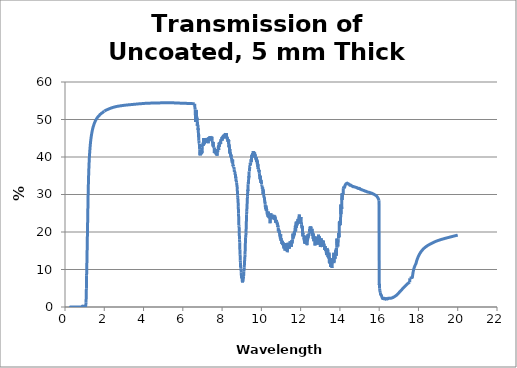
| Category | Series 0 |
|---|---|
| 0.2 | 0.035 |
| 0.21 | 0.001 |
| 0.22 | 0.003 |
| 0.23 | 0.002 |
| 0.24 | 0.006 |
| 0.25 | 0.004 |
| 0.26 | 0.007 |
| 0.27 | 0.01 |
| 0.28 | 0.009 |
| 0.29 | 0.01 |
| 0.3 | 0.008 |
| 0.31 | 0.002 |
| 0.32 | 0 |
| 0.33 | 0.002 |
| 0.34 | 0.003 |
| 0.35 | 0.001 |
| 0.36 | 0.004 |
| 0.37 | 0.001 |
| 0.38 | 0 |
| 0.39 | 0.001 |
| 0.4 | 0 |
| 0.41 | 0.002 |
| 0.42 | 0.002 |
| 0.43 | 0.002 |
| 0.44 | 0.003 |
| 0.45 | 0.001 |
| 0.46 | 0.001 |
| 0.47 | 0.006 |
| 0.48 | 0.008 |
| 0.49 | 0.001 |
| 0.5 | 0 |
| 0.51 | 0.003 |
| 0.52 | 0.005 |
| 0.53 | 0.008 |
| 0.54 | 0.008 |
| 0.55 | 0.003 |
| 0.56 | 0.001 |
| 0.57 | 0.005 |
| 0.58 | 0.006 |
| 0.59 | 0.004 |
| 0.6 | 0.006 |
| 0.61 | 0.007 |
| 0.62 | 0.005 |
| 0.63 | 0.007 |
| 0.64 | 0.005 |
| 0.65 | 0.003 |
| 0.66 | 0.006 |
| 0.67 | 0.006 |
| 0.68 | 0.003 |
| 0.69 | 0.005 |
| 0.7 | 0.006 |
| 0.71 | 0.004 |
| 0.72 | 0.006 |
| 0.73 | 0.007 |
| 0.74 | 0.004 |
| 0.75 | 0.005 |
| 0.76 | 0.005 |
| 0.77 | 0.003 |
| 0.78 | 0.005 |
| 0.79 | 0.005 |
| 0.8 | 0.005 |
| 0.81 | 0.005 |
| 0.82 | 0.003 |
| 0.83 | 0.006 |
| 0.84 | 0.005 |
| 0.85 | 0.025 |
| 0.86 | 0.058 |
| 0.87 | 0.173 |
| 0.88 | 0.228 |
| 0.89 | 0.239 |
| 0.9 | 0.217 |
| 0.91 | 0.198 |
| 0.92 | 0.178 |
| 0.93 | 0.204 |
| 0.94 | 0.229 |
| 0.95 | 0.2 |
| 0.96 | 0.166 |
| 0.97 | 0.136 |
| 0.98 | 0.11 |
| 0.99 | 0.09 |
| 1.0 | 0.073 |
| 1.01 | 0.096 |
| 1.02 | 0.149 |
| 1.03 | 0.175 |
| 1.04 | 0.192 |
| 1.05 | 0.255 |
| 1.06 | 0.54 |
| 1.07 | 1.258 |
| 1.08 | 2.666 |
| 1.09 | 5.006 |
| 1.1 | 8.44 |
| 1.11 | 10.669 |
| 1.12 | 13.213 |
| 1.13 | 15.979 |
| 1.14 | 18.865 |
| 1.15 | 21.82 |
| 1.16 | 24.784 |
| 1.17 | 27.65 |
| 1.18 | 30.31 |
| 1.19 | 32.607 |
| 1.2 | 34.524 |
| 1.21 | 36.13 |
| 1.22 | 37.499 |
| 1.23 | 38.69 |
| 1.24 | 39.722 |
| 1.25 | 40.62 |
| 1.26 | 41.416 |
| 1.27 | 42.127 |
| 1.28 | 42.772 |
| 1.29 | 43.359 |
| 1.3 | 43.896 |
| 1.31 | 44.389 |
| 1.32 | 44.831 |
| 1.33 | 45.226 |
| 1.34 | 45.583 |
| 1.35 | 45.913 |
| 1.36 | 46.223 |
| 1.37 | 46.508 |
| 1.38 | 46.792 |
| 1.39 | 47.058 |
| 1.4 | 47.299 |
| 1.41 | 47.528 |
| 1.42 | 47.741 |
| 1.43 | 47.939 |
| 1.44 | 48.125 |
| 1.45 | 48.299 |
| 1.46 | 48.465 |
| 1.47 | 48.625 |
| 1.48 | 48.776 |
| 1.49 | 48.919 |
| 1.5 | 49.055 |
| 1.51 | 49.184 |
| 1.52 | 49.308 |
| 1.53 | 49.426 |
| 1.54 | 49.539 |
| 1.55 | 49.647 |
| 1.56 | 49.749 |
| 1.57 | 49.847 |
| 1.58 | 49.942 |
| 1.59 | 50.034 |
| 1.6 | 50.122 |
| 1.61 | 50.207 |
| 1.62 | 50.288 |
| 1.63 | 50.365 |
| 1.64 | 50.439 |
| 1.65 | 50.512 |
| 1.66 | 50.582 |
| 1.67 | 50.65 |
| 1.68 | 50.716 |
| 1.69 | 50.78 |
| 1.7 | 50.842 |
| 1.71 | 50.903 |
| 1.72 | 50.961 |
| 1.73 | 51.015 |
| 1.74 | 51.069 |
| 1.75 | 51.122 |
| 1.76 | 51.179 |
| 1.77 | 51.244 |
| 1.78 | 51.304 |
| 1.79 | 51.353 |
| 1.8 | 51.399 |
| 1.81 | 51.442 |
| 1.82 | 51.484 |
| 1.83 | 51.526 |
| 1.84 | 51.571 |
| 1.85 | 51.612 |
| 1.86 | 51.651 |
| 1.87 | 51.703 |
| 1.88 | 51.742 |
| 1.89 | 51.773 |
| 1.9 | 51.804 |
| 1.91 | 51.835 |
| 1.92 | 51.879 |
| 1.93 | 51.927 |
| 1.94 | 51.975 |
| 1.95 | 52.021 |
| 1.96 | 52.061 |
| 1.97 | 52.1 |
| 1.98 | 52.133 |
| 1.99 | 52.164 |
| 2.0 | 52.195 |
| 2.0000658340912802 | 52.226 |
| 2.0099426675075898 | 52.257 |
| 2.02009856612705 | 52.289 |
| 2.02996929826891 | 52.319 |
| 2.0398370004275 | 52.348 |
| 2.04998346034472 | 52.373 |
| 2.0598449707261897 | 52.399 |
| 2.06998503080197 | 52.424 |
| 2.07984028883395 | 52.454 |
| 2.08997388678498 | 52.483 |
| 2.0998228319334897 | 52.51 |
| 2.10994990551615 | 52.538 |
| 2.1200736471999 | 52.56 |
| 2.12991296429671 | 52.584 |
| 2.14003008788415 | 52.608 |
| 2.14986294050753 | 52.631 |
| 2.1599733838562103 | 52.651 |
| 2.1697997116098198 | 52.675 |
| 2.17990341261835 | 52.697 |
| 2.19000367126184 | 52.718 |
| 2.19982005175428 | 52.741 |
| 2.20991347454654 | 52.764 |
| 2.22000340758378 | 52.79 |
| 2.2298097038741598 | 52.811 |
| 2.2398927076444504 | 52.83 |
| 2.24997217431841 | 52.851 |
| 2.25976824960652 | 52.875 |
| 2.2698406936944697 | 52.895 |
| 2.27990955339415 | 52.919 |
| 2.28997481280544 | 52.938 |
| 2.29975701491494 | 52.955 |
| 2.30981512717729 | 52.975 |
| 2.31986959192627 | 52.994 |
| 2.32992039328452 | 53.016 |
| 2.3396884784778 | 53.037 |
| 2.34973200830224 | 53.058 |
| 2.3597718275791197 | 53.076 |
| 2.36980792045418 | 53.093 |
| 2.3798402710790603 | 53.112 |
| 2.3898688636113103 | 53.128 |
| 2.39989368221442 | 53.142 |
| 2.40963640045946 | 53.161 |
| 2.41965372964289 | 53.178 |
| 2.42966723786282 | 53.196 |
| 2.43967690930653 | 53.214 |
| 2.4496827281674 | 53.228 |
| 2.45968467864487 | 53.244 |
| 2.46968274494449 | 53.261 |
| 2.47967691127795 | 53.276 |
| 2.48966716186311 | 53.289 |
| 2.4996534809239903 | 53.302 |
| 2.5096358526908196 | 53.316 |
| 2.5196142614000903 | 53.328 |
| 2.52958869129452 | 53.342 |
| 2.53983602598691 | 53.356 |
| 2.5498023393828197 | 53.367 |
| 2.55976462629279 | 53.381 |
| 2.56972287098501 | 53.394 |
| 2.5796770577340697 | 53.407 |
| 2.58962717082094 | 53.421 |
| 2.59957319453302 | 53.434 |
| 2.60979121882037 | 53.444 |
| 2.61972890198083 | 53.454 |
| 2.6296624482317603 | 53.464 |
| 2.63959184188676 | 53.478 |
| 2.64951706726593 | 53.489 |
| 2.65971363330442 | 53.502 |
| 2.6696303582391603 | 53.519 |
| 2.67954286746317 | 53.525 |
| 2.6897263147114 | 53.536 |
| 2.69963022736521 | 53.542 |
| 2.70952987693441 | 53.548 |
| 2.7197000579704698 | 53.561 |
| 2.72959101496818 | 53.57 |
| 2.7394776615690897 | 53.577 |
| 2.74963442916314 | 53.585 |
| 2.7595122873171 | 53.592 |
| 2.76965998937296 | 53.6 |
| 2.77952899494085 | 53.608 |
| 2.7896675655672603 | 53.616 |
| 2.79952765446743 | 53.625 |
| 2.8096570278323902 | 53.631 |
| 2.81950813604112 | 53.64 |
| 2.82962824637237 | 53.649 |
| 2.83947030992423 | 53.657 |
| 2.8495810915096498 | 53.666 |
| 2.85941404649793 | 53.674 |
| 2.86951543368599 | 53.682 |
| 2.87961203427909 | 53.689 |
| 2.88943114346328 | 53.698 |
| 2.89951825084737 | 53.706 |
| 2.90960052158927 | 53.714 |
| 2.91940564020169 | 53.722 |
| 2.9294783190629 | 53.73 |
| 2.93954611130598 | 53.735 |
| 2.94933709478521 | 53.743 |
| 2.95939519661736 | 53.75 |
| 2.9694483619274803 | 53.758 |
| 2.97949657394605 | 53.764 |
| 2.9895398159118 | 53.773 |
| 2.99957807107174 | 53.78 |
| 3.00934021965164 | 53.786 |
| 3.01936858687776 | 53.791 |
| 3.0293919175411403 | 53.797 |
| 3.03941019492205 | 53.802 |
| 3.04942340230913 | 53.81 |
| 3.05943152299951 | 53.818 |
| 3.06943454029879 | 53.821 |
| 3.0794324375211 | 53.826 |
| 3.0894251979891 | 53.832 |
| 3.09941280503401 | 53.836 |
| 3.10939524199566 | 53.842 |
| 3.11937249222249 | 53.845 |
| 3.1293445390716204 | 53.85 |
| 3.1393113659088097 | 53.857 |
| 3.1492729561085597 | 53.866 |
| 3.1592292930540897 | 53.869 |
| 3.16944923460165 | 53.876 |
| 3.17939487211586 | 53.884 |
| 3.18933520612994 | 53.889 |
| 3.19927022006257 | 53.894 |
| 3.20919989734131 | 53.899 |
| 3.21939237192605 | 53.9 |
| 3.22931118085665 | 53.906 |
| 3.2392246030224903 | 53.913 |
| 3.2494003310347397 | 53.919 |
| 3.25930278335964 | 53.923 |
| 3.26919979889124 | 53.926 |
| 3.27935862480045 | 53.932 |
| 3.28924456916596 | 53.935 |
| 3.29939198988443 | 53.94 |
| 3.3092667953267 | 53.947 |
| 3.31913608063146 | 53.953 |
| 3.32926634014336 | 53.958 |
| 3.33912438548313 | 53.963 |
| 3.3492430665413 | 53.968 |
| 3.35935585470692 | 53.972 |
| 3.36919683760228 | 53.977 |
| 3.3792979428538 | 53.983 |
| 3.38912751656538 | 53.989 |
| 3.39921686967096 | 53.999 |
| 3.40930024195657 | 54.002 |
| 3.4191124986363004 | 54.007 |
| 3.42918401461892 | 54.013 |
| 3.43924949705528 | 54.019 |
| 3.44930892823547 | 54.022 |
| 3.4590978061987596 | 54.024 |
| 3.46914524218086 | 54.027 |
| 3.47918657430612 | 54.033 |
| 3.4892217849071296 | 54.037 |
| 3.4992508563272198 | 54.043 |
| 3.50927377092055 | 54.047 |
| 3.51902699188112 | 54.051 |
| 3.5290377031020697 | 54.056 |
| 3.5390422050872097 | 54.059 |
| 3.5490404802339097 | 54.066 |
| 3.5590325109505003 | 54.07 |
| 3.5690182796562997 | 54.077 |
| 3.57899776878166 | 54.082 |
| 3.58923332799103 | 54.086 |
| 3.59920003887791 | 54.091 |
| 3.6091604170804596 | 54.094 |
| 3.61911444507367 | 54.099 |
| 3.6290621053437397 | 54.102 |
| 3.63900338038806 | 54.107 |
| 3.64919961010111 | 54.11 |
| 3.65912789304255 | 54.114 |
| 3.66904973785839 | 54.122 |
| 3.6789651270914403 | 54.123 |
| 3.68913471667679 | 54.13 |
| 3.69903697138116 | 54.137 |
| 3.70893271774111 | 54.144 |
| 3.71908209270929 | 54.153 |
| 3.7289645977349 | 54.157 |
| 3.73910034626381 | 54.164 |
| 3.7489695385608703 | 54.168 |
| 3.75909158742681 | 54.169 |
| 3.7689473956972903 | 54.174 |
| 3.7790556717755197 | 54.18 |
| 3.78889802481807 | 54.185 |
| 3.7989924550833396 | 54.19 |
| 3.80907984470592 | 54.194 |
| 3.8189017933209404 | 54.198 |
| 3.82897522730752 | 54.203 |
| 3.83904156508458 | 54.206 |
| 3.84910078799625 | 54.209 |
| 3.85889522078111 | 54.213 |
| 3.86894034166794 | 54.218 |
| 3.8789782922782203 | 54.223 |
| 3.88900905400868 | 54.226 |
| 3.89903260826941 | 54.228 |
| 3.90904893648382 | 54.233 |
| 3.91905802008873 | 54.236 |
| 3.92880347448211 | 54.238 |
| 3.93879820017381 | 54.244 |
| 3.94904161781629 | 54.249 |
| 3.95902153762044 | 54.255 |
| 3.96899412020128 | 54.261 |
| 3.97895934707668 | 54.265 |
| 3.98891719977817 | 54.27 |
| 3.99886765985095 | 54.273 |
| 4.0088107088539 | 54.277 |
| 4.01900098997837 | 54.28 |
| 4.02892897035924 | 54.286 |
| 4.0388494839578994 | 54.291 |
| 4.0487625123887305 | 54.294 |
| 4.058921926268829 | 54.3 |
| 4.06881973615228 | 54.302 |
| 4.07896350265228 | 54.308 |
| 4.0888460187208 | 54.307 |
| 4.09872095696331 | 54.308 |
| 4.1088412078051295 | 54.311 |
| 4.11870074002454 | 54.315 |
| 4.128805151352569 | 54.317 |
| 4.13890151336369 | 54.323 |
| 4.14873769754802 | 54.324 |
| 4.1588181043471995 | 54.323 |
| 4.1688904033176595 | 54.328 |
| 4.1787030697462795 | 54.33 |
| 4.18875929808195 | 54.336 |
| 4.19880736021703 | 54.338 |
| 4.20884723656231 | 54.337 |
| 4.21887890754453 | 54.332 |
| 4.22865186785294 | 54.332 |
| 4.23866727580289 | 54.332 |
| 4.2486744202541 | 54.335 |
| 4.25867328169711 | 54.34 |
| 4.26866384063866 | 54.338 |
| 4.27864607760161 | 54.337 |
| 4.2886199731251 | 54.341 |
| 4.2988345388386096 | 54.345 |
| 4.30879148340901 | 54.348 |
| 4.31874002776994 | 54.351 |
| 4.32868015252619 | 54.354 |
| 4.3386118382989896 | 54.358 |
| 4.34878303787177 | 54.362 |
| 4.35869757541715 | 54.368 |
| 4.36860361545856 | 54.369 |
| 4.37874846747569 | 54.371 |
| 4.38863724093891 | 54.373 |
| 4.39876435418029 | 54.378 |
| 4.408635782010769 | 54.379 |
| 4.41874507551645 | 54.382 |
| 4.42859907879829 | 54.384 |
| 4.438690471750809 | 54.384 |
| 4.448526971707429 | 54.387 |
| 4.45860038343241 | 54.385 |
| 4.468664662841721 | 54.385 |
| 4.47871978932123 | 54.385 |
| 4.4885208283377 | 54.387 |
| 4.498557811681301 | 54.389 |
| 4.50858558086654 | 54.393 |
| 4.51860411535408 | 54.395 |
| 4.528613394623481 | 54.398 |
| 4.53861339817326 | 54.397 |
| 4.54860410552094 | 54.398 |
| 4.55858549620308 | 54.402 |
| 4.5685575497753295 | 54.404 |
| 4.57852024581246 | 54.406 |
| 4.5884735639084 | 54.407 |
| 4.59865990072383 | 54.409 |
| 4.60859417181752 | 54.412 |
| 4.61851900337118 | 54.413 |
| 4.62843437505631 | 54.411 |
| 4.63858175507092 | 54.411 |
| 4.64847791413899 | 54.413 |
| 4.658605570368141 | 54.411 |
| 4.66848243375049 | 54.412 |
| 4.67859028118231 | 54.414 |
| 4.68844776597221 | 54.415 |
| 4.69853571976111 | 54.416 |
| 4.70861357461071 | 54.417 |
| 4.71844171868192 | 54.417 |
| 4.72849955242443 | 54.418 |
| 4.73854722282397 | 54.419 |
| 4.74858470828426 | 54.42 |
| 4.75837336127226 | 54.421 |
| 4.768390655928569 | 54.421 |
| 4.778397701500761 | 54.424 |
| 4.78839447647988 | 54.423 |
| 4.79838095937907 | 54.424 |
| 4.80835712873357 | 54.426 |
| 4.8183229631008 | 54.426 |
| 4.82851534984788 | 54.427 |
| 4.83846020265051 | 54.43 |
| 4.848394655762919 | 54.432 |
| 4.858318687832201 | 54.434 |
| 4.86846818792866 | 54.435 |
| 4.87837106454777 | 54.437 |
| 4.888498860841549 | 54.439 |
| 4.89838049483114 | 54.439 |
| 4.90848649816283 | 54.439 |
| 4.91834680253056 | 54.439 |
| 4.92843092393258 | 54.44 |
| 4.93826981187388 | 54.44 |
| 4.94833196257132 | 54.44 |
| 4.95838296492419 | 54.439 |
| 4.9684227962881 | 54.44 |
| 4.9784514340438 | 54.441 |
| 4.98823601986218 | 54.438 |
| 4.998242464267579 | 54.438 |
| 5.008532041370899 | 54.438 |
| 5.018351078245869 | 54.44 |
| 5.02816908173511 | 54.441 |
| 5.03798604981686 | 54.441 |
| 5.0485570090299 | 54.44 |
| 5.05837182019091 | 54.442 |
| 5.06818558972505 | 54.442 |
| 5.07799831561147 | 54.441 |
| 5.08856469709201 | 54.44 |
| 5.0983752489461 | 54.439 |
| 5.10818475093576 | 54.44 |
| 5.117993201041 | 54.439 |
| 5.12855496862371 | 54.439 |
| 5.1383612275924895 | 54.44 |
| 5.148166428462879 | 54.44 |
| 5.15797056921577 | 54.439 |
| 5.16852768675108 | 54.439 |
| 5.178329619270871 | 54.438 |
| 5.18813048546191 | 54.439 |
| 5.19793028330601 | 54.439 |
| 5.20848271466029 | 54.439 |
| 5.2182802871822 | 54.439 |
| 5.22807678514867 | 54.44 |
| 5.23787220654239 | 54.44 |
| 5.24841991559805 | 54.439 |
| 5.25821309458812 | 54.439 |
| 5.26800519079973 | 54.44 |
| 5.2785493119507 | 54.438 |
| 5.28833915287207 | 54.438 |
| 5.2981279048113805 | 54.436 |
| 5.30791556575293 | 54.435 |
| 5.31845490126825 | 54.436 |
| 5.32824028985158 | 54.437 |
| 5.33802458123637 | 54.437 |
| 5.347807773407809 | 54.437 |
| 5.358342287214691 | 54.438 |
| 5.36812318996774 | 54.438 |
| 5.3779029873095 | 54.437 |
| 5.38843383821533 | 54.438 |
| 5.398211333268271 | 54.437 |
| 5.40798771671413 | 54.438 |
| 5.4177629865397305 | 54.437 |
| 5.42828895247958 | 54.439 |
| 5.43806190296998 | 54.439 |
| 5.44783373364721 | 54.44 |
| 5.45835598896381 | 54.438 |
| 5.46812548744588 | 54.438 |
| 5.47789385992406 | 54.44 |
| 5.48841238410373 | 54.441 |
| 5.498178411531351 | 54.44 |
| 5.507943306766521 | 54.44 |
| 5.51770706779845 | 54.44 |
| 5.52822061663666 | 54.438 |
| 5.53798201559167 | 54.437 |
| 5.54774227415782 | 54.436 |
| 5.558252044193 | 54.43 |
| 5.56800992783749 | 54.429 |
| 5.57776666490975 | 54.427 |
| 5.58827263565256 | 54.426 |
| 5.598026984963051 | 54.425 |
| 5.60778018152015 | 54.423 |
| 5.61828233248867 | 54.421 |
| 5.6280331284485605 | 54.421 |
| 5.63778276547613 | 54.421 |
| 5.6482810761958895 | 54.419 |
| 5.6580282997954905 | 54.421 |
| 5.66777435828614 | 54.417 |
| 5.67826880829012 | 54.415 |
| 5.688012440526729 | 54.415 |
| 5.6977549014800095 | 54.414 |
| 5.70824547030876 | 54.41 |
| 5.71798549218666 | 54.407 |
| 5.72772433660915 | 54.403 |
| 5.73821100381076 | 54.402 |
| 5.74794739634129 | 54.399 |
| 5.7576826052466 | 54.399 |
| 5.76816535037678 | 54.398 |
| 5.777898094578339 | 54.392 |
| 5.7876296489872 | 54.389 |
| 5.798108451609299 | 54.383 |
| 5.8078375285074095 | 54.379 |
| 5.81756540944764 | 54.374 |
| 5.828040249132711 | 54.371 |
| 5.83776563976003 | 54.369 |
| 5.84748982826663 | 54.363 |
| 5.85796068459343 | 54.361 |
| 5.86768236998981 | 54.356 |
| 5.8781505260093 | 54.357 |
| 5.88786969966004 | 54.353 |
| 5.897587660872571 | 54.352 |
| 5.90805179934563 | 54.35 |
| 5.91776723602339 | 54.346 |
| 5.9274814541064 | 54.344 |
| 5.93794155463266 | 54.342 |
| 5.9476532353967 | 54.338 |
| 5.95811059878025 | 54.334 |
| 5.96781973359879 | 54.332 |
| 5.9775276395156896 | 54.335 |
| 5.98798093079947 | 54.332 |
| 5.99768627799497 | 54.331 |
| 6.008136809090289 | 54.328 |
| 6.01783958894346 | 54.327 |
| 6.02754112959485 | 54.328 |
| 6.0379875544597 | 54.324 |
| 6.0476865150012395 | 54.325 |
| 6.05738423019488 | 54.322 |
| 6.06782652846342 | 54.32 |
| 6.0775216507847 | 54.32 |
| 6.08796115209172 | 54.317 |
| 6.09765367292883 | 54.317 |
| 6.1080903680012995 | 54.316 |
| 6.11778027874469 | 54.313 |
| 6.12746892970638 | 54.31 |
| 6.13790145035456 | 54.309 |
| 6.14758747847197 | 54.307 |
| 6.15801716988551 | 54.307 |
| 6.1677005665548705 | 54.307 |
| 6.17738269316287 | 54.304 |
| 6.18780817608937 | 54.302 |
| 6.19748765850733 | 54.299 |
| 6.2079102892145706 | 54.297 |
| 6.21758711884456 | 54.294 |
| 6.2280068880745105 | 54.29 |
| 6.23768105632093 | 54.289 |
| 6.247353940095509 | 54.287 |
| 6.25776945308771 | 54.287 |
| 6.26743966274888 | 54.286 |
| 6.2778522913011 | 54.284 |
| 6.2875198182591605 | 54.282 |
| 6.2979295531222395 | 54.279 |
| 6.30759438878986 | 54.277 |
| 6.317257925588989 | 54.274 |
| 6.32766335650945 | 54.273 |
| 6.33732418930059 | 54.27 |
| 6.34772670359139 | 54.268 |
| 6.357384823793169 | 54.269 |
| 6.367784412214119 | 54.267 |
| 6.37743981124757 | 54.263 |
| 6.38783646456109 | 54.261 |
| 6.39748913384967 | 54.258 |
| 6.40788284282078 | 54.254 |
| 6.41753277379037 | 54.251 |
| 6.427181383252799 | 54.248 |
| 6.43757071326561 | 54.249 |
| 6.4472165717111105 | 54.245 |
| 6.45760293447642 | 54.242 |
| 6.46724603333692 | 54.24 |
| 6.47762941962888 | 54.237 |
| 6.48726975033877 | 54.236 |
| 6.49765015093418 | 54.231 |
| 6.50728770493029 | 54.232 |
| 6.51766511060862 | 54.229 |
| 6.52729987933026 | 54.228 |
| 6.53767428087363 | 54.225 |
| 6.54730625576257 | 54.224 |
| 6.55767764395577 | 54.219 |
| 6.56730681645627 | 54.218 |
| 6.577675182086771 | 54.214 |
| 6.58730154364558 | 54.211 |
| 6.59766687750353 | 54.21 |
| 6.6072904195699005 | 54.21 |
| 6.61765271244814 | 52.804 |
| 6.6272734264738205 | 52.649 |
| 6.63763266916789 | 51.633 |
| 6.647250546607149 | 49.342 |
| 6.6576067299153 | 52.211 |
| 6.66722176222492 | 52.436 |
| 6.67757487694813 | 50.63 |
| 6.68718705558741 | 52.566 |
| 6.69753709252939 | 51.23 |
| 6.70714640896018 | 50.563 |
| 6.71749335892734 | 49.937 |
| 6.7270998046140305 | 50.485 |
| 6.73744365841555 | 48.34 |
| 6.74704722482508 | 49.332 |
| 6.75738797327289 | 48.36 |
| 6.7669886518747395 | 48.448 |
| 6.77732628578352 | 47.205 |
| 6.78766230113088 | 47.658 |
| 6.79725857823695 | 45.291 |
| 6.807591465102499 | 45.991 |
| 6.81718483292805 | 44.344 |
| 6.82751458213344 | 43.752 |
| 6.83710503215703 | 43.515 |
| 6.847431634526719 | 43.507 |
| 6.85701915822948 | 42.087 |
| 6.86734260459073 | 40.845 |
| 6.8769271934564005 | 40.452 |
| 6.88724747463925 | 41.212 |
| 6.8975661110093 | 40.459 |
| 6.90714622699151 | 41.365 |
| 6.9174616842638 | 41.216 |
| 6.92703884397215 | 41.26 |
| 6.93735111298383 | 40.728 |
| 6.946925307911269 | 41.266 |
| 6.95723437950232 | 40.81 |
| 6.96754178956629 | 41.789 |
| 6.9771114661576705 | 41.102 |
| 6.98741566489678 | 42.428 |
| 6.996982355293779 | 43.208 |
| 7.00728333355518 | 42.954 |
| 7.01684702926004 | 43.282 |
| 7.02714477789373 | 43.071 |
| 7.03744084830435 | 43.902 |
| 7.046999980270249 | 43.03 |
| 7.05729280716421 | 45.011 |
| 7.06684892304803 | 44.257 |
| 7.07713849728261 | 44.276 |
| 7.08742638135459 | 45.059 |
| 7.09697790103131 | 43.371 |
| 7.10726251856599 | 44.409 |
| 7.11681100078769 | 45.026 |
| 7.12709234264961 | 44.016 |
| 7.1373719824189505 | 43.82 |
| 7.14691583599132 | 44.25 |
| 7.1571921862211 | 44.912 |
| 7.16746682716988 | 44.434 |
| 7.17700603254473 | 44.638 |
| 7.18727737009388 | 43.938 |
| 7.1968135037899 | 44.098 |
| 7.20708152881577 | 44.407 |
| 7.21734783264605 | 43.752 |
| 7.2268792857442 | 44.12 |
| 7.237142263202379 | 44.483 |
| 7.24740351228586 | 45.086 |
| 7.25693026526338 | 44.561 |
| 7.26718817413275 | 44.407 |
| 7.27671182125208 | 44.361 |
| 7.2869663807956 | 44.832 |
| 7.29721920006543 | 43.647 |
| 7.30673811470614 | 45.247 |
| 7.316987570819481 | 44.71 |
| 7.327235279489449 | 44.384 |
| 7.33674944215446 | 44.729 |
| 7.34699377384418 | 45.021 |
| 7.357236350924469 | 45.057 |
| 7.36674574212641 | 45.068 |
| 7.37698492840961 | 44.904 |
| 7.3872223529208805 | 45.542 |
| 7.39672695318216 | 44.937 |
| 7.4069609730864405 | 45.406 |
| 7.41719322405992 | 45.358 |
| 7.42669301391278 | 44.568 |
| 7.43692184647635 | 45.12 |
| 7.44714890295385 | 45.258 |
| 7.45664386294037 | 44.443 |
| 7.46686748721205 | 44.331 |
| 7.47708932824603 | 45.449 |
| 7.487309383601151 | 44.859 |
| 7.49679783395746 | 44.219 |
| 7.50701443861108 | 44.08 |
| 7.51722925043911 | 44.187 |
| 7.5267128254078495 | 43.686 |
| 7.53692417275496 | 42.817 |
| 7.54713372013345 | 43.991 |
| 7.556612400289899 | 43.335 |
| 7.56681846941515 | 42.806 |
| 7.57702273143241 | 42.618 |
| 7.58722518390471 | 42.644 |
| 7.59669726736074 | 42.573 |
| 7.60689622311593 | 41.064 |
| 7.61709336219176 | 42.406 |
| 7.62656050539257 | 41.424 |
| 7.6367541339957 | 41.915 |
| 7.64694593878881 | 40.902 |
| 7.6571359173378895 | 40.964 |
| 7.66659640291535 | 41.442 |
| 7.6767828525504 | 41.569 |
| 7.6869674688157605 | 42.061 |
| 7.69715024927916 | 41.855 |
| 7.70660404236314 | 40.572 |
| 7.7167832754841905 | 41.05 |
| 7.72696066568264 | 41.065 |
| 7.73713621052795 | 40.801 |
| 7.74658327627302 | 40.324 |
| 7.75675525536073 | 42.037 |
| 7.766925381979741 | 41.728 |
| 7.77709365370122 | 41.278 |
| 7.786533957286729 | 42.111 |
| 7.796698644848511 | 41.849 |
| 7.8068614704023105 | 42.803 |
| 7.8170224315210595 | 43.017 |
| 7.82645593815126 | 41.863 |
| 7.83661329672141 | 43.217 |
| 7.84676878375116 | 43.735 |
| 7.85692239681518 | 43.81 |
| 7.86707413348858 | 42.721 |
| 7.87649906385922 | 43.589 |
| 7.886647174933111 | 43.376 |
| 7.89679340251751 | 44.018 |
| 7.9069377441893005 | 43.594 |
| 7.9163557992482 | 44.234 |
| 7.9264964969616205 | 43.501 |
| 7.93663530166874 | 44.715 |
| 7.94677221094819 | 44.545 |
| 7.9569072223790895 | 44.536 |
| 7.96704033354099 | 44.772 |
| 7.9764479474168 | 45.029 |
| 7.9865773869406 | 44.715 |
| 7.99670491910956 | 44.974 |
| 8.00683054150504 | 44.378 |
| 8.01695425170883 | 45.33 |
| 8.02635312544983 | 45.444 |
| 8.03647314102809 | 45.525 |
| 8.04659123733543 | 44.874 |
| 8.05670741195542 | 45.64 |
| 8.06682166247212 | 45.074 |
| 8.07693398647006 | 45.935 |
| 8.08632227447941 | 45.765 |
| 8.0964308762287 | 45.024 |
| 8.106537544387951 | 45.294 |
| 8.11664227654347 | 46.068 |
| 8.12674507028207 | 45.939 |
| 8.13684592319098 | 45.295 |
| 8.14694483285792 | 45.023 |
| 8.15632064973148 | 45.346 |
| 8.16641580490695 | 46.376 |
| 8.17650900977857 | 45.436 |
| 8.18660026193588 | 45.945 |
| 8.19668955896888 | 45.67 |
| 8.20677689846806 | 45.266 |
| 8.21686227802435 | 46.415 |
| 8.22622551627242 | 45.337 |
| 8.23630710913745 | 45.472 |
| 8.24638673500719 | 45.473 |
| 8.25646439147441 | 44.726 |
| 8.26654007613237 | 45.236 |
| 8.276613786574801 | 44.895 |
| 8.28668552039589 | 44.577 |
| 8.29675527519032 | 44.021 |
| 8.306823048553209 | 44.728 |
| 8.3161699189557 | 44.812 |
| 8.32623386419684 | 43.527 |
| 8.33629582096637 | 44.528 |
| 8.34635578686129 | 42.571 |
| 8.35641375947909 | 43.121 |
| 8.36646973641771 | 43.181 |
| 8.3765237152756 | 42.677 |
| 8.38657569365165 | 40.912 |
| 8.396625669145251 | 42.133 |
| 8.406673639356281 | 41.453 |
| 8.41671960188506 | 40.952 |
| 8.42676355433243 | 41.105 |
| 8.436088279665 | 40.336 |
| 8.44612834875333 | 40.02 |
| 8.45616640073684 | 40.669 |
| 8.466202433218259 | 40.177 |
| 8.476236443800762 | 39.567 |
| 8.48626843008803 | 39.528 |
| 8.49629838968424 | 39.001 |
| 8.50632632019401 | 38.673 |
| 8.51635221922249 | 38.733 |
| 8.52637608437529 | 38.564 |
| 8.536397913258499 | 39.327 |
| 8.54641770347871 | 38.115 |
| 8.556435452643012 | 37.521 |
| 8.566451158358939 | 37.869 |
| 8.57646481823455 | 37.666 |
| 8.58647642987839 | 37.464 |
| 8.596485990899481 | 37.274 |
| 8.60649349890733 | 37.326 |
| 8.616498951511959 | 36.73 |
| 8.62650234632385 | 35.991 |
| 8.63650368095401 | 36.311 |
| 8.6465029530139 | 36.026 |
| 8.6565001601155 | 35.986 |
| 8.66649529987128 | 35.225 |
| 8.6764883698942 | 35.413 |
| 8.68647936779772 | 34.35 |
| 8.69646829119577 | 34.756 |
| 8.70645513770282 | 34.325 |
| 8.71643990493379 | 33.464 |
| 8.726422590504129 | 33.668 |
| 8.73640319202976 | 33.199 |
| 8.74638170712714 | 32.808 |
| 8.75635813341317 | 32.341 |
| 8.76633246850529 | 32.02 |
| 8.77630471002144 | 31.219 |
| 8.78627485558003 | 29.794 |
| 8.79624290280001 | 29.3 |
| 8.806208849300791 | 28.675 |
| 8.81617269270231 | 27.874 |
| 8.826134430625011 | 26.701 |
| 8.83609406068983 | 24.904 |
| 8.8460515805182 | 23.742 |
| 8.85600698773206 | 21.643 |
| 8.86596027995388 | 21.521 |
| 8.87591145480659 | 19.766 |
| 8.88586050991367 | 18.011 |
| 8.896517856845911 | 17.201 |
| 8.90646251349343 | 15.232 |
| 8.91640504309911 | 14.094 |
| 8.92634544328846 | 12.426 |
| 8.936283711687532 | 11.786 |
| 8.94621984592286 | 10.315 |
| 8.956153843621491 | 9.885 |
| 8.966085702410998 | 9.859 |
| 8.97601541991944 | 9.188 |
| 8.985942993775419 | 8.003 |
| 8.995868421608009 | 7.693 |
| 9.00579170104684 | 8.209 |
| 9.01642139940802 | 7.426 |
| 9.02634022106433 | 7.287 |
| 9.0362568870496 | 6.526 |
| 9.04617139499552 | 7.731 |
| 9.05608374253431 | 6.753 |
| 9.06599392729871 | 7.13 |
| 9.07590194692197 | 7.626 |
| 9.08580779903785 | 7.828 |
| 9.09571148128064 | 8.234 |
| 9.10632015881589 | 9.359 |
| 9.11621933879816 | 9.56 |
| 9.12611634164444 | 10.483 |
| 9.136011164991151 | 11.23 |
| 9.14590380647519 | 12.25 |
| 9.155794263734 | 12.788 |
| 9.165682534405551 | 14.031 |
| 9.17627468099962 | 15.214 |
| 9.186158414800149 | 17.065 |
| 9.19603995476185 | 18.573 |
| 9.2059192985248 | 18.513 |
| 9.21579644372962 | 19.789 |
| 9.22567138801746 | 20.933 |
| 9.23624924044527 | 22.698 |
| 9.24611961818922 | 24.637 |
| 9.255987787774389 | 25.556 |
| 9.265853746844082 | 26.497 |
| 9.27571749304209 | 27.603 |
| 9.28628333425352 | 28.902 |
| 9.296142489152869 | 29.542 |
| 9.30599942394698 | 31.291 |
| 9.31585413628183 | 30.949 |
| 9.325706623803901 | 32.729 |
| 9.33626038890034 | 33.298 |
| 9.34610826039718 | 32.91 |
| 9.35595389985596 | 34.847 |
| 9.365797304925339 | 34.571 |
| 9.375638473254519 | 36.11 |
| 9.38618009741156 | 36.156 |
| 9.396016625017289 | 36.49 |
| 9.40585090866584 | 37.211 |
| 9.415682946008578 | 37.558 |
| 9.42621477635345 | 37.615 |
| 9.43604215316522 | 38.476 |
| 9.445867276460909 | 37.861 |
| 9.455690143894081 | 38.458 |
| 9.46551075311883 | 38.505 |
| 9.47603032584643 | 39.353 |
| 9.48584624989349 | 38.713 |
| 9.49565990853026 | 38.657 |
| 9.50617202620929 | 40.492 |
| 9.515980984755469 | 39.898 |
| 9.52578767069456 | 40.342 |
| 9.53559208168454 | 40.723 |
| 9.54609428058795 | 39.901 |
| 9.5558939717354 | 41.077 |
| 9.56569138074375 | 41.031 |
| 9.57548650527319 | 40.39 |
| 9.58597874382479 | 41.59 |
| 9.595769128778429 | 40.721 |
| 9.60555722206999 | 41.532 |
| 9.61604191918323 | 40.926 |
| 9.62582525802492 | 40.739 |
| 9.63560629802653 | 41.114 |
| 9.6460834300799 | 40.745 |
| 9.65585970076827 | 41.229 |
| 9.665633665443709 | 41.03 |
| 9.67540532177202 | 40.127 |
| 9.685872389342359 | 40.681 |
| 9.6956392566714 | 39.764 |
| 9.70540380848737 | 39.972 |
| 9.71586325613013 | 39.631 |
| 9.725623004108488 | 39.865 |
| 9.73538042941307 | 39.126 |
| 9.745832233563629 | 39.927 |
| 9.75558484020311 | 38.62 |
| 9.76603147614372 | 38.891 |
| 9.775779254124279 | 39.303 |
| 9.78552469745272 | 39.304 |
| 9.7959636504827 | 38.075 |
| 9.80570425034291 | 38.906 |
| 9.815442508404331 | 37.39 |
| 9.82587375500523 | 38.047 |
| 9.83560715480002 | 36.773 |
| 9.845338205654599 | 37.147 |
| 9.85576172232536 | 36.75 |
| 9.86548790012586 | 36.453 |
| 9.875906190327271 | 36.109 |
| 9.885627485106971 | 36.551 |
| 9.8953464190006 | 35.686 |
| 9.90575693996023 | 35.262 |
| 9.915470976064011 | 34.612 |
| 9.92587624405834 | 34.262 |
| 9.93558537241796 | 34.136 |
| 9.94529212796057 | 35.048 |
| 9.95568958745058 | 34.939 |
| 9.96539142049849 | 33.1 |
| 9.97578360056041 | 33.197 |
| 9.985480501171839 | 33.794 |
| 9.99586739115646 | 33.898 |
| 10.0055593493947 | 32.751 |
| 10.0152489181047 | 32.625 |
| 10.0256279445915 | 32.476 |
| 10.0353125562038 | 32.447 |
| 10.0456862661974 | 31.519 |
| 10.055365910787899 | 31.57 |
| 10.065734293658 | 31.896 |
| 10.0754089613077 | 30.912 |
| 10.085772006429401 | 30.161 |
| 10.0954416872242 | 31.315 |
| 10.1057993839782 | 31.03 |
| 10.1154640680094 | 30.152 |
| 10.1258164057818 | 29.557 |
| 10.135476083145601 | 29.296 |
| 10.1451333399545 | 29.27 |
| 10.155477712125899 | 29.144 |
| 10.165129947592 | 28.513 |
| 10.175468934454 | 27.876 |
| 10.1851161386864 | 28.039 |
| 10.1954497296441 | 27.253 |
| 10.2057805254614 | 26.496 |
| 10.215420077221301 | 26.538 |
| 10.2257454610703 | 26.114 |
| 10.235379956721399 | 27.053 |
| 10.2456999180212 | 25.663 |
| 10.2553293476907 | 26.489 |
| 10.2656438758662 | 25.971 |
| 10.2752682296865 | 26.129 |
| 10.2855773141681 | 25.048 |
| 10.2951965822768 | 24.746 |
| 10.3055002125004 | 24.832 |
| 10.315114385040301 | 24.865 |
| 10.3254125504474 | 24.268 |
| 10.335707885084 | 24.033 |
| 10.3453143076043 | 24.901 |
| 10.3556041614154 | 25.482 |
| 10.3652054635772 | 24.439 |
| 10.3754898260184 | 23.909 |
| 10.3850859979829 | 24.291 |
| 10.395364858515501 | 23.722 |
| 10.4056408690999 | 24.234 |
| 10.4152292385401 | 23.652 |
| 10.425499731236899 | 24.233 |
| 10.4350829457365 | 24.214 |
| 10.4453479100211 | 22.324 |
| 10.4556100106543 | 23.898 |
| 10.4651853851135 | 24.005 |
| 10.4754419413772 | 23.557 |
| 10.4850121361861 | 24.985 |
| 10.49526313757 | 23.707 |
| 10.505511261617999 | 23.816 |
| 10.5150735789212 | 23.4 |
| 10.5253161321538 | 23.734 |
| 10.535555799811199 | 23.83 |
| 10.5451102170517 | 24.031 |
| 10.5553442979711 | 24.28 |
| 10.565575485083 | 23.758 |
| 10.5751219797223 | 24.512 |
| 10.585347564186801 | 24.385 |
| 10.594888824797899 | 24.594 |
| 10.6051087961366 | 23.846 |
| 10.615325860024601 | 24.277 |
| 10.6255400136608 | 24.194 |
| 10.6350705955571 | 24.35 |
| 10.6452791147669 | 24.535 |
| 10.655484715513 | 24.06 |
| 10.665007307305101 | 23.494 |
| 10.6752072577552 | 23.455 |
| 10.6854042815367 | 24.365 |
| 10.694918860761199 | 23.454 |
| 10.7051102183904 | 23.9 |
| 10.715298641153 | 23.153 |
| 10.7254841262556 | 22.504 |
| 10.7349879261327 | 23.295 |
| 10.745167723842199 | 22.686 |
| 10.7553445757031 | 22.523 |
| 10.7648403105018 | 23.168 |
| 10.7750114591447 | 22.901 |
| 10.785179653757 | 22.779 |
| 10.7953448915512 | 22.412 |
| 10.8048297766602 | 22.592 |
| 10.8149892900376 | 21.926 |
| 10.8251458384244 | 22.3 |
| 10.835299419036101 | 21.346 |
| 10.844773414225399 | 21.666 |
| 10.854921249245999 | 21.211 |
| 10.8650661083283 | 20.217 |
| 10.8752079886912 | 20.8 |
| 10.8853468875541 | 20.647 |
| 10.8948071673986 | 20.447 |
| 10.9049402941472 | 19.769 |
| 10.9150704312445 | 20.332 |
| 10.9251975759134 | 20.046 |
| 10.9353217253775 | 19.069 |
| 10.944768226754901 | 18.841 |
| 10.9548865776199 | 19.325 |
| 10.9650019251406 | 18.312 |
| 10.9751142665438 | 18.834 |
| 10.985223599057202 | 19.383 |
| 10.9953299199093 | 17.649 |
| 11.0047597664058 | 18.391 |
| 11.0148602568568 | 17.629 |
| 11.0249577275214 | 17.76 |
| 11.0350521756313 | 17.563 |
| 11.045143598419099 | 16.829 |
| 11.055231993118099 | 17.688 |
| 11.0646450937216 | 16.896 |
| 11.0747276262738 | 17.587 |
| 11.0848071226267 | 16.468 |
| 11.0948835800168 | 16.824 |
| 11.1049569956817 | 17.272 |
| 11.1150273668596 | 16.976 |
| 11.1250946907897 | 16.273 |
| 11.135158964712 | 16.083 |
| 11.1452201858674 | 15.609 |
| 11.1546079022381 | 15.905 |
| 11.164663213556599 | 16.99 |
| 11.1747154640193 | 15.932 |
| 11.1847646508705 | 16.352 |
| 11.1948107713549 | 15.599 |
| 11.2048538227185 | 15.045 |
| 11.2148938022079 | 16.536 |
| 11.2249307070705 | 15.782 |
| 11.234964534554699 | 15.499 |
| 11.244995281909599 | 15.256 |
| 11.255022946385399 | 16.19 |
| 11.2650475252327 | 15.522 |
| 11.2750690157034 | 16.163 |
| 11.285087415049901 | 17.076 |
| 11.295102720525799 | 14.95 |
| 11.3051149293852 | 16.391 |
| 11.3151240388832 | 14.623 |
| 11.325130046275701 | 14.821 |
| 11.3351329488197 | 15.953 |
| 11.345132743772599 | 15.985 |
| 11.3551294283931 | 16.844 |
| 11.3651229999404 | 17.125 |
| 11.3751134556748 | 16.043 |
| 11.3851007928573 | 15.677 |
| 11.3950850087499 | 16.427 |
| 11.4050661006153 | 16.368 |
| 11.415044065717101 | 16.665 |
| 11.4250189013199 | 15.545 |
| 11.434990604688998 | 16.442 |
| 11.4449591730905 | 16.286 |
| 11.4549246037915 | 16.58 |
| 11.464886894060001 | 17.535 |
| 11.4748460411647 | 17.014 |
| 11.4848020423753 | 16.312 |
| 11.4947548949623 | 16.361 |
| 11.504704596197099 | 16.443 |
| 11.5146511433518 | 16.878 |
| 11.524594533699599 | 17.208 |
| 11.534534764514499 | 16.05 |
| 11.544471833071201 | 17.294 |
| 11.5544057366455 | 17.834 |
| 11.5649984088756 | 16.972 |
| 11.574925762857 | 17.932 |
| 11.5848499435067 | 17.585 |
| 11.5947709481042 | 18.048 |
| 11.6046887739295 | 19.563 |
| 11.6146034182635 | 19.197 |
| 11.6245148783881 | 18.291 |
| 11.634423151585999 | 19.454 |
| 11.6443282351409 | 18.745 |
| 11.654890138844198 | 18.922 |
| 11.664788621865801 | 19.33 |
| 11.6746839069194 | 20.033 |
| 11.6845759912921 | 19.176 |
| 11.6944648722721 | 20.302 |
| 11.7043505471483 | 20.045 |
| 11.7148917301236 | 21.07 |
| 11.7247707704643 | 21.318 |
| 11.7346465963927 | 21.728 |
| 11.744519205201101 | 20.111 |
| 11.754388594183 | 21.727 |
| 11.7642547606326 | 22.549 |
| 11.7747751165178 | 22.709 |
| 11.7846346144969 | 21.139 |
| 11.7944908816515 | 21.915 |
| 11.8043439152796 | 21.666 |
| 11.814850250707899 | 22.809 |
| 11.8246965931554 | 22.179 |
| 11.8345396937953 | 22.123 |
| 11.8443795499289 | 22.622 |
| 11.8542161588588 | 23.09 |
| 11.8647049595387 | 23.502 |
| 11.8745348490359 | 22.513 |
| 11.884361483062001 | 22.636 |
| 11.894184858923 | 23.28 |
| 11.9046595322518 | 22.91 |
| 11.9144761660384 | 24.119 |
| 11.9242895334037 | 23.867 |
| 11.9347535219068 | 24.672 |
| 11.9445601301438 | 23.136 |
| 11.9543634637119 | 22.471 |
| 11.964163519923401 | 22.543 |
| 11.974613297813399 | 23.036 |
| 11.9844065723084 | 23.762 |
| 11.9941965612104 | 22.594 |
| 12.0046355915615 | 22.214 |
| 12.014418781733701 | 24.017 |
| 12.0241986780849 | 22.283 |
| 12.0346269339824 | 22.538 |
| 12.0444000146079 | 22.091 |
| 12.0541697931929 | 21.473 |
| 12.064587247749799 | 21.175 |
| 12.0743501936309 | 21.086 |
| 12.0841098292605 | 21.655 |
| 12.0945164556177 | 20.796 |
| 12.1042692415828 | 18.812 |
| 12.1146685555396 | 19.321 |
| 12.124414480420201 | 19.798 |
| 12.1341570813238 | 19.498 |
| 12.1445455221836 | 19.281 |
| 12.154281245071699 | 19.201 |
| 12.1646623433005 | 19.179 |
| 12.174391176773101 | 18.006 |
| 12.1841166725673 | 18.563 |
| 12.1944868528803 | 16.916 |
| 12.2042054423576 | 18.716 |
| 12.2145682498623 | 18.026 |
| 12.224279921642799 | 17.614 |
| 12.2346353442048 | 17.21 |
| 12.2443400869166 | 17.127 |
| 12.254041472773201 | 16.858 |
| 12.264385914689699 | 18.174 |
| 12.2740803546181 | 17.611 |
| 12.2844173814892 | 18.886 |
| 12.2941048641378 | 17.3 |
| 12.304434463859499 | 18.253 |
| 12.3141149778847 | 18.989 |
| 12.3244371383615 | 16.494 |
| 12.334110672427899 | 18.198 |
| 12.344425381573101 | 17.517 |
| 12.3540919243535 | 18.996 |
| 12.364399170089 | 18.027 |
| 12.374058710264501 | 19.429 |
| 12.384358480521099 | 18.895 |
| 12.3940110067807 | 18.535 |
| 12.404303289498001 | 18.816 |
| 12.4139487905391 | 19.564 |
| 12.4242335736652 | 19.735 |
| 12.4345144813222 | 19.675 |
| 12.4441493096855 | 19.841 |
| 12.454422699496101 | 20.562 |
| 12.4640504742385 | 20.82 |
| 12.4743163341731 | 19.782 |
| 12.483937044021001 | 21.474 |
| 12.494195362058798 | 21.062 |
| 12.5044497828044 | 21.361 |
| 12.514059759875899 | 21.029 |
| 12.5243066205164 | 21.428 |
| 12.533909504364098 | 19.979 |
| 12.5441487929011 | 20.724 |
| 12.5543841685639 | 20.14 |
| 12.563976276724102 | 19.764 |
| 12.5742040621089 | 20.45 |
| 12.5844279252445 | 20.882 |
| 12.594009231899099 | 18.973 |
| 12.604225486602699 | 19.847 |
| 12.6137996547437 | 19.821 |
| 12.624008289052599 | 19.028 |
| 12.6342129855769 | 18.235 |
| 12.6437763094294 | 19.064 |
| 12.653973367439 | 19.59 |
| 12.664166478317 | 17.534 |
| 12.674355638884 | 18.878 |
| 12.683904386404299 | 18.719 |
| 12.6940858842004 | 18.287 |
| 12.7042634223526 | 18.427 |
| 12.713801265386401 | 17.559 |
| 12.7239711226959 | 18.288 |
| 12.7341370110396 | 16.396 |
| 12.7442989272465 | 18.808 |
| 12.7538221133645 | 17.727 |
| 12.7639763245372 | 17.97 |
| 12.7741265542653 | 18.201 |
| 12.7842727993827 | 18.221 |
| 12.7937812825299 | 17.554 |
| 12.8039197984588 | 18.361 |
| 12.814054320483699 | 18.681 |
| 12.8241848454434 | 17.776 |
| 12.8336785796357 | 18.691 |
| 12.8438013512901 | 18.326 |
| 12.8539201166002 | 17.644 |
| 12.8640348724098 | 16.616 |
| 12.874145615563801 | 17.662 |
| 12.8842523429083 | 17.645 |
| 12.8937237498195 | 16.85 |
| 12.903822687563101 | 18.008 |
| 12.91391760024 | 19.299 |
| 12.9240084847015 | 17.978 |
| 12.9340953377999 | 17.539 |
| 12.9441781563889 | 16.818 |
| 12.953627131865 | 17.175 |
| 12.9637021246429 | 18.832 |
| 12.9737730736762 | 17.441 |
| 12.9838399758234 | 18.108 |
| 12.9939028279444 | 17.11 |
| 13.003961626900299 | 16.011 |
| 13.0140163695534 | 16.16 |
| 13.0240670527675 | 16.871 |
| 13.034113673407301 | 16.556 |
| 13.0441562283392 | 16.402 |
| 13.0535674283134 | 18.321 |
| 13.0636020970228 | 16.917 |
| 13.0736326908259 | 17.624 |
| 13.083659206594 | 16.328 |
| 13.093681641199401 | 17.752 |
| 13.1036999915158 | 16.233 |
| 13.113714254418301 | 16.66 |
| 13.1237244267832 | 16.042 |
| 13.1337305054879 | 17.552 |
| 13.1437324874113 | 16.253 |
| 13.1537303694335 | 17.711 |
| 13.1637241484358 | 17.31 |
| 13.173713821301 | 16.467 |
| 13.183699384913 | 16.91 |
| 13.1936808361569 | 16.514 |
| 13.2036581719194 | 16.307 |
| 13.2136313890881 | 16.127 |
| 13.2236004845522 | 15.189 |
| 13.233565455202001 | 16.256 |
| 13.2435262979291 | 15.651 |
| 13.2534830096265 | 16.231 |
| 13.2634355871885 | 15.8 |
| 13.2740056675904 | 14.893 |
| 13.2839497086947 | 15.541 |
| 13.2938896061601 | 15.099 |
| 13.303825356886 | 15.456 |
| 13.313756957773299 | 13.891 |
| 13.323684405723899 | 15.034 |
| 13.3336076976412 | 13.814 |
| 13.343526830429902 | 13.881 |
| 13.3534418009959 | 15.683 |
| 13.363971893202502 | 15.484 |
| 13.373878269418 | 13.851 |
| 13.3837804739434 | 15.302 |
| 13.3936785036898 | 13.296 |
| 13.4035723555698 | 14.286 |
| 13.4134620264972 | 13.217 |
| 13.4233475133871 | 14.36 |
| 13.4338462552957 | 12.95 |
| 13.4437231028713 | 14.468 |
| 13.4535957569702 | 14.048 |
| 13.4634642145127 | 11.821 |
| 13.4733284724207 | 13.236 |
| 13.4838046414536 | 11.577 |
| 13.4936602278992 | 12.224 |
| 13.5035116052912 | 12.084 |
| 13.513358770556701 | 11.965 |
| 13.5238167649756 | 10.738 |
| 13.533655233031 | 11.473 |
| 13.5434894795573 | 10.729 |
| 13.5533195014869 | 12.791 |
| 13.563759267453602 | 12.003 |
| 13.5735805664701 | 11.259 |
| 13.5833976315036 | 11.656 |
| 13.5938236204883 | 10.391 |
| 13.6036319432623 | 11.372 |
| 13.6134360226796 | 11.763 |
| 13.6238482041804 | 13.013 |
| 13.633643522017401 | 12.288 |
| 13.643434587136 | 13.039 |
| 13.6532213964822 | 12.49 |
| 13.6636152149349 | 11.727 |
| 13.673393237110801 | 12.579 |
| 13.6837777123006 | 14.443 |
| 13.6935469343315 | 12.366 |
| 13.7033118849585 | 11.77 |
| 13.7136824614022 | 11.844 |
| 13.7234385926405 | 13.87 |
| 13.7331904431509 | 12.774 |
| 13.7435470905088 | 13.367 |
| 13.7532901024125 | 12.879 |
| 13.763637351881199 | 13.349 |
| 13.7733715122501 | 15.035 |
| 13.7837093500997 | 13.902 |
| 13.7934346460174 | 15.191 |
| 13.8031556393735 | 15.376 |
| 13.8134794770924 | 15.526 |
| 13.823191586839998 | 13.697 |
| 13.8335059788772 | 15.814 |
| 13.8432091921294 | 18.24 |
| 13.8535141247985 | 17.565 |
| 13.8632084286799 | 16.522 |
| 13.8735038883072 | 17.66 |
| 13.883189269954201 | 16.257 |
| 13.8934752428786 | 16.079 |
| 13.903151689439602 | 16.13 |
| 13.9134281620125 | 17.967 |
| 13.9230956606477 | 18.246 |
| 13.933362619233 | 19.711 |
| 13.943624671355598 | 19.761 |
| 13.9532785880888 | 19.201 |
| 13.9635311055873 | 18.571 |
| 13.9731760421532 | 22.797 |
| 13.9834190114235 | 21.655 |
| 13.9930549550241 | 21.581 |
| 14.003288362474501 | 22.965 |
| 14.013516838838799 | 22.412 |
| 14.0231391323755 | 21.912 |
| 14.0333580263509 | 22.275 |
| 14.0435719786515 | 27.331 |
| 14.0531805928131 | 24.763 |
| 14.063384942185 | 25.955 |
| 14.0735843393085 | 26.125 |
| 14.0831792448255 | 27.167 |
| 14.0933690185096 | 26.146 |
| 14.1035538293869 | 30.3 |
| 14.1131349970315 | 28.562 |
| 14.123310163988101 | 29.385 |
| 14.1334803575944 | 29.725 |
| 14.143047758180801 | 30.303 |
| 14.1532082874145 | 30.052 |
| 14.163363832769601 | 30.085 |
| 14.17351439067 | 31.656 |
| 14.183063297713899 | 31.608 |
| 14.193204163882399 | 32.133 |
| 14.2033400320881 | 31.845 |
| 14.213470898761999 | 31.877 |
| 14.2230012600337 | 31.799 |
| 14.233122407669299 | 31.978 |
| 14.2432385432855 | 31.965 |
| 14.25334966332 | 32.352 |
| 14.2634557642124 | 32.353 |
| 14.272962800434199 | 32.569 |
| 14.2830591481285 | 32.603 |
| 14.2931504662188 | 32.733 |
| 14.3032367511516 | 32.866 |
| 14.3133179993751 | 32.835 |
| 14.3233942073394 | 32.904 |
| 14.3328730897597 | 32.897 |
| 14.342939503563802 | 32.879 |
| 14.353000866677899 | 32.944 |
| 14.3630571755588 | 33.022 |
| 14.3731084266655 | 33.039 |
| 14.3831546164584 | 32.974 |
| 14.3931957413999 | 32.946 |
| 14.4032317979542 | 32.836 |
| 14.4132627825872 | 32.909 |
| 14.4232886917666 | 32.883 |
| 14.433309521962 | 32.87 |
| 14.4433252696445 | 32.841 |
| 14.4533359312873 | 32.782 |
| 14.4633415033652 | 32.725 |
| 14.4733419823549 | 32.657 |
| 14.4833373647349 | 32.595 |
| 14.493327646985302 | 32.483 |
| 14.503312825588301 | 32.441 |
| 14.5132928970277 | 32.514 |
| 14.5232678577892 | 32.589 |
| 14.5332377043601 | 32.503 |
| 14.5432024332297 | 32.54 |
| 14.553162040889099 | 32.431 |
| 14.563116523831 | 32.449 |
| 14.5730658785502 | 32.427 |
| 14.583010101543199 | 32.362 |
| 14.592949189308099 | 32.365 |
| 14.602883138345 | 32.273 |
| 14.612811945155899 | 32.269 |
| 14.6227356062443 | 32.225 |
| 14.633237399559802 | 32.181 |
| 14.643150455512599 | 32.132 |
| 14.653058355059601 | 32.117 |
| 14.662961094712 | 32.101 |
| 14.672858670982599 | 32.057 |
| 14.682751080386101 | 32.127 |
| 14.6932197606474 | 32.101 |
| 14.7031015214165 | 32.097 |
| 14.712978104669 | 32.047 |
| 14.7228495069267 | 32.046 |
| 14.7327157247137 | 32.056 |
| 14.7431566534981 | 32.035 |
| 14.753012186437 | 31.994 |
| 14.762862524283701 | 31.991 |
| 14.7727076635696 | 31.967 |
| 14.7831262585915 | 31.958 |
| 14.7929606840437 | 31.938 |
| 14.8027899003363 | 31.944 |
| 14.8126139040081 | 31.915 |
| 14.823010104827999 | 31.896 |
| 14.8328233657426 | 31.872 |
| 14.8426314034605 | 31.862 |
| 14.8530106876316 | 31.867 |
| 14.862807960836001 | 31.813 |
| 14.872600000284999 | 31.783 |
| 14.8829623336103 | 31.728 |
| 14.892743586824999 | 31.7 |
| 14.9030944917003 | 31.684 |
| 14.9128649440811 | 31.686 |
| 14.9226301450796 | 31.671 |
| 14.932964042019599 | 31.587 |
| 14.9427184205228 | 31.622 |
| 14.9530408506401 | 31.642 |
| 14.9627843920884 | 31.583 |
| 14.9725226645759 | 31.581 |
| 14.982828029825399 | 31.596 |
| 14.9925554436565 | 31.622 |
| 15.0028493038162 | 31.636 |
| 15.012565844471402 | 31.554 |
| 15.0228481841764 | 31.463 |
| 15.0325538371526 | 31.425 |
| 15.0428246410553 | 31.378 |
| 15.0525193918656 | 31.375 |
| 15.0627786446354 | 31.385 |
| 15.0724624788092 | 31.36 |
| 15.082710165133099 | 31.314 |
| 15.0929518970418 | 31.312 |
| 15.1026191727978 | 31.253 |
| 15.1128493151048 | 31.252 |
| 15.1225056379131 | 31.24 |
| 15.1327241753485 | 31.247 |
| 15.1429367386241 | 31.209 |
| 15.152576448107201 | 31.189 |
| 15.162777383421501 | 31.181 |
| 15.1724061037489 | 31.14 |
| 15.1825953958757 | 31.122 |
| 15.1927786941542 | 31.106 |
| 15.202390746405799 | 31.097 |
| 15.2125623784731 | 31.062 |
| 15.2227280048618 | 31.071 |
| 15.2328876215585 | 31.024 |
| 15.2424772933323 | 30.992 |
| 15.2526252130373 | 30.98 |
| 15.2627671112475 | 30.975 |
| 15.272902983959 | 30.971 |
| 15.2824702163522 | 30.946 |
| 15.2925943613634 | 30.877 |
| 15.302712469100499 | 30.834 |
| 15.3128245355691 | 30.84 |
| 15.322369269816999 | 30.834 |
| 15.3324695779488 | 30.831 |
| 15.3425638330643 | 30.836 |
| 15.352652031178701 | 30.797 |
| 15.3627341683091 | 30.755 |
| 15.3728102404754 | 30.723 |
| 15.3823209583598 | 30.694 |
| 15.3923852261552 | 30.701 |
| 15.4024434172806 | 30.708 |
| 15.412495527765302 | 30.666 |
| 15.4225415536408 | 30.658 |
| 15.4325814909412 | 30.634 |
| 15.442615335702799 | 30.619 |
| 15.4526430839644 | 30.623 |
| 15.4626647317673 | 30.596 |
| 15.472680275155 | 30.592 |
| 15.482689710173599 | 30.585 |
| 15.4926930328715 | 30.558 |
| 15.5026902392996 | 30.557 |
| 15.512681325510998 | 30.525 |
| 15.522666287561501 | 30.519 |
| 15.5326451215092 | 30.472 |
| 15.542617823414599 | 30.474 |
| 15.5525843893407 | 30.459 |
| 15.5625448153527 | 30.437 |
| 15.572499097518499 | 30.433 |
| 15.582447231908299 | 30.394 |
| 15.5923892145947 | 30.399 |
| 15.602325041652701 | 30.383 |
| 15.61225470916 | 30.361 |
| 15.6221782131963 | 30.35 |
| 15.632646332078501 | 30.332 |
| 15.642557154457599 | 30.284 |
| 15.6524618014028 | 30.241 |
| 15.662360269004001 | 30.225 |
| 15.6722525533534 | 30.191 |
| 15.6821386505457 | 30.19 |
| 15.6925672587456 | 30.165 |
| 15.7024406256387 | 30.14 |
| 15.712307793456999 | 30.109 |
| 15.722168758304901 | 30.074 |
| 15.7325708207748 | 30.056 |
| 15.7424190228499 | 30.028 |
| 15.7522610100672 | 30 |
| 15.7620967785414 | 29.972 |
| 15.772472227738302 | 29.931 |
| 15.7822952010488 | 29.911 |
| 15.792111943759101 | 29.883 |
| 15.8024672973501 | 29.848 |
| 15.8122712205476 | 29.818 |
| 15.8220689013107 | 29.794 |
| 15.8324041211274 | 29.763 |
| 15.842188958075699 | 29.712 |
| 15.8525106119152 | 29.667 |
| 15.862282588726801 | 29.607 |
| 15.872048303360499 | 29.547 |
| 15.882349759746099 | 29.492 |
| 15.8921025900204 | 29.423 |
| 15.9023904376598 | 29.363 |
| 15.9121303673061 | 29.288 |
| 15.9224045890384 | 29.208 |
| 15.9321316018097 | 29.1 |
| 15.9423921804965 | 28.997 |
| 15.9521062601673 | 28.897 |
| 15.9623531786932 | 28.792 |
| 15.9720543090597 | 28.677 |
| 15.982287550331899 | 28.554 |
| 15.9919757152117 | 28.433 |
| 16.0021952621603 | 5.851 |
| 16.0124077702628 | 6.176 |
| 16.0220762809707 | 4.912 |
| 16.0322750689575 | 4.346 |
| 16.042466804866898 | 4.399 |
| 16.0521156244585 | 3.776 |
| 16.0622936145125 | 3.782 |
| 16.0719294036701 | 3.363 |
| 16.0820936308911 | 3.289 |
| 16.092250784121102 | 3.183 |
| 16.102400858892402 | 3.224 |
| 16.1120101857189 | 3.116 |
| 16.1221464633132 | 2.918 |
| 16.1322756492987 | 2.767 |
| 16.1423977392198 | 2.626 |
| 16.151980537853902 | 2.52 |
| 16.1620887963487 | 2.372 |
| 16.1721899456653 | 2.247 |
| 16.182283981360502 | 2.326 |
| 16.1923708989943 | 2.371 |
| 16.201920356237302 | 2.325 |
| 16.2119933996528 | 2.303 |
| 16.2220593119387 | 2.212 |
| 16.2321180886674 | 2.172 |
| 16.2421697254142 | 2.234 |
| 16.2522142177578 | 2.252 |
| 16.2622515612799 | 2.318 |
| 16.2722817515655 | 2.241 |
| 16.282304784202502 | 2.21 |
| 16.292320654782298 | 2.137 |
| 16.3018027637347 | 2.202 |
| 16.3118046745097 | 2.175 |
| 16.3217994102513 | 2.14 |
| 16.3317869665632 | 2.086 |
| 16.3422924227337 | 2.244 |
| 16.3522652285611 | 2.265 |
| 16.3622308415579 | 2.211 |
| 16.3721892573405 | 2.162 |
| 16.3821404715285 | 2.202 |
| 16.3920844797448 | 2.178 |
| 16.4020212776151 | 2.222 |
| 16.4119508607688 | 2.172 |
| 16.421873224838 | 2.149 |
| 16.4317883654583 | 2.198 |
| 16.4422175470646 | 2.207 |
| 16.4521178469451 | 2.304 |
| 16.462010910072898 | 2.355 |
| 16.4718967320966 | 2.338 |
| 16.481775308667597 | 2.33 |
| 16.4921659780473 | 2.298 |
| 16.502029668763303 | 2.308 |
| 16.5118861007721 | 2.338 |
| 16.5217352697382 | 2.335 |
| 16.532094964755498 | 2.371 |
| 16.5419292118014 | 2.36 |
| 16.5517561825896 | 2.318 |
| 16.5620924968379 | 2.343 |
| 16.5719045186109 | 2.341 |
| 16.581709250941 | 2.308 |
| 16.5920221420525 | 2.347 |
| 16.6018118983338 | 2.373 |
| 16.6121090156306 | 2.385 |
| 16.6218837777198 | 2.361 |
| 16.631651228381898 | 2.38 |
| 16.6419248519 | 2.42 |
| 16.6516772814391 | 2.438 |
| 16.6619350837325 | 2.449 |
| 16.671137630634 | 2.464 |
| 16.6820567109542 | 2.479 |
| 16.692975466049 | 2.496 |
| 16.701164318813 | 2.55 |
| 16.712082504251402 | 2.586 |
| 16.7230003638792 | 2.628 |
| 16.7311885446587 | 2.649 |
| 16.7421058336057 | 2.643 |
| 16.7530227961567 | 2.692 |
| 16.7612103037445 | 2.705 |
| 16.772126694590398 | 2.74 |
| 16.7830427584551 | 2.77 |
| 16.7912295916441 | 2.802 |
| 16.8021450827795 | 2.84 |
| 16.813060246348503 | 2.884 |
| 16.8212464039316 | 2.91 |
| 16.8321609937472 | 2.943 |
| 16.8430752554112 | 2.982 |
| 16.8512607361816 | 3.018 |
| 16.8621744230681 | 3.062 |
| 16.873087781217897 | 3.101 |
| 16.881272583968798 | 3.16 |
| 16.8921853663172 | 3.203 |
| 16.9003697369728 | 3.241 |
| 16.911281942868403 | 3.296 |
| 16.9221938190699 | 3.344 |
| 16.930377509731198 | 3.399 |
| 16.941288808456097 | 3.451 |
| 16.9521997769018 | 3.499 |
| 16.9603827863624 | 3.554 |
| 16.9712931763077 | 3.597 |
| 16.982203235388997 | 3.657 |
| 16.9903855624424 | 3.717 |
| 17.0012950419997 | 3.789 |
| 17.012204190107898 | 3.846 |
| 17.0203858335478 | 3.898 |
| 17.0312944011086 | 3.951 |
| 17.042202636635498 | 3.998 |
| 17.050383595255497 | 4.052 |
| 17.0612912492115 | 4.101 |
| 17.0721985705488 | 4.162 |
| 17.0803788431429 | 4.221 |
| 17.0912855818858 | 4.281 |
| 17.102191987425403 | 4.328 |
| 17.1103715727875 | 4.385 |
| 17.1212773947094 | 4.441 |
| 17.1321828828433 | 4.497 |
| 17.1403617797673 | 4.563 |
| 17.151266683260403 | 4.631 |
| 17.1621712523807 | 4.688 |
| 17.1703494596609 | 4.748 |
| 17.1812534431173 | 4.803 |
| 17.1921570916163 | 4.865 |
| 17.200334608046898 | 4.928 |
| 17.211237669859003 | 4.98 |
| 17.222140396129202 | 5.033 |
| 17.2303172205045 | 5.08 |
| 17.2412193590648 | 5.138 |
| 17.2521211614987 | 5.205 |
| 17.260297292613302 | 5.26 |
| 17.2711985063144 | 5.313 |
| 17.2820993833047 | 5.381 |
| 17.290274819952998 | 5.435 |
| 17.3011751071878 | 5.489 |
| 17.3120750571273 | 5.539 |
| 17.3202497981041 | 5.587 |
| 17.3311491572654 | 5.644 |
| 17.3420481785471 | 5.694 |
| 17.350222222647 | 5.737 |
| 17.361120652128 | 5.792 |
| 17.372018743145 | 5.846 |
| 17.380192089163 | 5.892 |
| 17.3910895873567 | 5.932 |
| 17.401986746502303 | 5.981 |
| 17.4101593932332 | 6.026 |
| 17.4210559585331 | 6.074 |
| 17.4319521842006 | 6.117 |
| 17.4401241304396 | 6.177 |
| 17.4510197612391 | 6.23 |
| 17.461915051822 | 6.275 |
| 17.4700862963642 | 6.311 |
| 17.480980991057 | 6.35 |
| 17.491875344949 | 6.394 |
| 17.500045886589703 | 6.433 |
| 17.5109396435694 | 6.474 |
| 17.5218330591642 | 6.509 |
| 17.532726133162 | 6.549 |
| 17.5408957143594 | 6.583 |
| 17.5517881900511 | 6.626 |
| 17.562680323561597 | 7.655 |
| 17.5708491990104 | 7.673 |
| 17.581740733193 | 7.695 |
| 17.5926319246105 | 7.715 |
| 17.6008000931063 | 7.735 |
| 17.611690684173997 | 7.756 |
| 17.6225809318927 | 7.776 |
| 17.630748392231197 | 7.796 |
| 17.6416380385784 | 7.817 |
| 17.652527340992698 | 7.837 |
| 17.6606940919698 | 7.857 |
| 17.6715827919908 | 7.878 |
| 17.6824711474953 | 7.897 |
| 17.6906371879069 | 7.917 |
| 17.7015249399965 | 8.364 |
| 17.712412346985797 | 8.742 |
| 17.720577675628 | 9.075 |
| 17.7314644781809 | 9.374 |
| 17.7423509350498 | 9.64 |
| 17.750515550718703 | 9.875 |
| 17.761401402129902 | 10.09 |
| 17.7722869072734 | 10.281 |
| 17.7804508087652 | 10.46 |
| 17.7913357074296 | 10.625 |
| 17.8022202592428 | 10.773 |
| 17.8103834453539 | 10.907 |
| 17.821267389666797 | 11.028 |
| 17.8321509865449 | 11.141 |
| 17.840313456071797 | 11.247 |
| 17.8511964444285 | 11.348 |
| 17.8620790847669 | 11.444 |
| 17.8702408365061 | 11.531 |
| 17.8811228673021 | 11.74 |
| 17.8920045494964 | 11.938 |
| 17.9001655822446 | 12.125 |
| 17.911046653875403 | 12.302 |
| 17.921927376321097 | 12.47 |
| 17.9300876888751 | 12.629 |
| 17.9409677997366 | 12.781 |
| 17.9518475608296 | 12.926 |
| 17.9600071519863 | 13.065 |
| 17.970886300474202 | 13.197 |
| 17.9817650986105 | 13.324 |
| 17.9899239671668 | 13.446 |
| 18.000802151677302 | 13.562 |
| 18.0116799852529 | 13.674 |
| 18.019838130006 | 13.782 |
| 18.0307153489352 | 13.885 |
| 18.041592216346398 | 13.985 |
| 18.0497496360934 | 14.081 |
| 18.060625887837702 | 14.173 |
| 18.0715017874808 | 14.262 |
| 18.0823773348106 | 14.349 |
| 18.0905337639749 | 14.432 |
| 18.1014086942464 | 14.513 |
| 18.1122832716216 | 14.592 |
| 18.1204389729373 | 14.667 |
| 18.1313129322339 | 14.741 |
| 18.1421865380512 | 14.812 |
| 18.150341510315897 | 14.882 |
| 18.1612144970344 | 14.949 |
| 18.1720871296906 | 15.014 |
| 18.180241371702 | 15.078 |
| 18.191113384239298 | 15.14 |
| 18.201985042131497 | 15.2 |
| 18.210138552687297 | 15.259 |
| 18.2210095894405 | 15.316 |
| 18.2318802709658 | 15.372 |
| 18.2400330488639 | 15.426 |
| 18.2509031082303 | 15.479 |
| 18.2617728117859 | 15.531 |
| 18.2699248558244 | 15.582 |
| 18.2807939362013 | 15.631 |
| 18.2916626601847 | 15.68 |
| 18.2998139691616 | 15.727 |
| 18.310682068946498 | 15.773 |
| 18.3215498117553 | 15.818 |
| 18.3297003844688 | 15.862 |
| 18.3405675020595 | 15.905 |
| 18.3514342620914 | 15.947 |
| 18.359584097339898 | 15.989 |
| 18.370450231134 | 16.029 |
| 18.3813160067868 | 16.069 |
| 18.3921814240864 | 16.108 |
| 18.4003302517644 | 16.146 |
| 18.411195041436102 | 16.183 |
| 18.422059472172098 | 16.22 |
| 18.430207559545202 | 16.256 |
| 18.441071361634 | 16.291 |
| 18.451934804204697 | 16.326 |
| 18.4600821500714 | 16.36 |
| 18.4709449629757 | 16.393 |
| 18.4818074157793 | 16.425 |
| 18.4899540189387 | 16.457 |
| 18.500815841056703 | 16.489 |
| 18.511677302491897 | 16.52 |
| 18.5198231617427 | 16.55 |
| 18.5306839914732 | 16.58 |
| 18.5415444599384 | 16.609 |
| 18.5496895740797 | 16.638 |
| 18.5605494098214 | 16.666 |
| 18.5714088837155 | 16.694 |
| 18.5795532515464 | 16.722 |
| 18.590412091698102 | 16.749 |
| 18.6012705694202 | 16.775 |
| 18.6121286845008 | 16.801 |
| 18.620272032700598 | 16.827 |
| 18.6311295126496 | 16.852 |
| 18.6419866293751 | 16.883 |
| 18.6501292284265 | 16.913 |
| 18.6609857090017 | 16.943 |
| 18.6718418257713 | 16.972 |
| 18.6799836744738 | 17.001 |
| 18.6908391540745 | 17.029 |
| 18.7016942692876 | 17.057 |
| 18.7098353664409 | 17.084 |
| 18.7206898434666 | 17.111 |
| 18.7315439555229 | 17.137 |
| 18.7396842999266 | 17.163 |
| 18.750537772776998 | 17.189 |
| 18.7613908800761 | 17.214 |
| 18.7695304705301 | 17.239 |
| 18.7803829376051 | 17.264 |
| 18.7912350385469 | 17.288 |
| 18.7993738738511 | 17.312 |
| 18.8102253335507 | 17.336 |
| 18.8210764265352 | 17.359 |
| 18.831927152593202 | 17.382 |
| 18.840064956213798 | 17.405 |
| 18.8509150396413 | 17.427 |
| 18.8617647555604 | 17.449 |
| 18.869901801195198 | 17.471 |
| 18.8807508734659 | 17.492 |
| 18.891599577646602 | 17.513 |
| 18.8997358640959 | 17.534 |
| 18.910583923610297 | 17.555 |
| 18.921431614453102 | 17.575 |
| 18.9295671405172 | 17.595 |
| 18.940414185675902 | 17.615 |
| 18.9512608615814 | 17.635 |
| 18.959395626061 | 17.654 |
| 18.9702416552648 | 17.674 |
| 18.9810873146339 | 17.693 |
| 18.9892213163296 | 17.711 |
| 19.0000663279794 | 17.73 |
| 19.010910969213 | 17.749 |
| 19.0217552398192 | 17.767 |
| 19.0298881994224 | 17.785 |
| 19.0407318209217 | 17.803 |
| 19.0515750712122 | 17.82 |
| 19.059707265197098 | 17.838 |
| 19.0705498653634 | 17.855 |
| 19.081392093739503 | 17.872 |
| 19.0895235209071 | 17.89 |
| 19.1003650981418 | 17.906 |
| 19.111206303005 | 17.923 |
| 19.1193369621565 | 17.94 |
| 19.130177514861103 | 17.956 |
| 19.141017694613 | 17.973 |
| 19.149147584549702 | 17.989 |
| 19.1599871111259 | 18.005 |
| 19.1708262641684 | 18.021 |
| 19.1816650434657 | 18.037 |
| 19.1897938825413 | 18.053 |
| 19.200632007276198 | 18.068 |
| 19.2114697576849 | 18.084 |
| 19.2195978247128 | 18.099 |
| 19.2304349195422 | 18.114 |
| 19.2412716394644 | 18.13 |
| 19.2493989332461 | 18.145 |
| 19.2602349965723 | 18.16 |
| 19.2710706844103 | 18.175 |
| 19.2791972037476 | 18.19 |
| 19.290032233972898 | 18.205 |
| 19.3008668881291 | 18.219 |
| 19.311701166005 | 18.234 |
| 19.3198266273509 | 18.249 |
| 19.330660246228 | 18.263 |
| 19.3414934882438 | 18.278 |
| 19.3496181723136 | 18.292 |
| 19.3604507543142 | 18.307 |
| 19.3712829588729 | 18.321 |
| 19.379406864468603 | 18.335 |
| 19.3902384079957 | 18.349 |
| 19.4010695735001 | 18.364 |
| 19.409192699423997 | 18.378 |
| 19.4200232028807 | 18.392 |
| 19.430853327734 | 18.406 |
| 19.438975672788498 | 18.42 |
| 19.449805134577897 | 18.434 |
| 19.460634217183298 | 18.448 |
| 19.4714629203936 | 18.462 |
| 19.479584198696298 | 18.475 |
| 19.490412237457303 | 18.489 |
| 19.501239896242602 | 18.503 |
| 19.5093603908457 | 18.517 |
| 19.5201873841657 | 18.53 |
| 19.5310139969297 | 18.544 |
| 19.539133706635702 | 18.558 |
| 19.5499596529187 | 18.572 |
| 19.560785218065 | 18.585 |
| 19.568904141677002 | 18.599 |
| 19.5797290393266 | 18.613 |
| 19.590553555259298 | 18.626 |
| 19.6013776892641 | 18.64 |
| 19.6094955390006 | 18.653 |
| 19.6203190041237 | 18.667 |
| 19.6311420867386 | 18.68 |
| 19.6392591475519 | 18.694 |
| 19.6500815602697 | 18.708 |
| 19.6609035898991 | 18.721 |
| 19.669019860592403 | 18.735 |
| 19.6798412193093 | 18.748 |
| 19.6906621943576 | 18.762 |
| 19.701482785526203 | 18.775 |
| 19.7095979768548 | 18.789 |
| 19.7204178957266 | 18.802 |
| 19.731237430138698 | 18.816 |
| 19.7393518285192 | 18.829 |
| 19.7501706896192 | 18.843 |
| 19.7609891656795 | 18.856 |
| 19.7691027699155 | 18.869 |
| 19.7799205716488 | 18.883 |
| 19.7907379877623 | 18.896 |
| 19.7988507966576 | 18.909 |
| 19.8096675374291 | 18.923 |
| 19.820483892001 | 18.936 |
| 19.8312998601623 | 18.949 |
| 19.8394115825745 | 18.962 |
| 19.85022687401 | 18.976 |
| 19.8610417784551 | 18.989 |
| 19.8691527026996 | 19.002 |
| 19.8799669294042 | 19.015 |
| 19.8907807685386 | 19.028 |
| 19.8988908934196 | 19.041 |
| 19.9097040537989 | 19.054 |
| 19.9205168260282 | 19.067 |
| 19.931329209896802 | 19.079 |
| 19.9394382428098 | 19.092 |
| 19.950249946539902 | 19.105 |
| 19.9610612613296 | 19.118 |
| 19.969169492052902 | 19.13 |
| 19.9799801256898 | 19.142 |
| 19.9907903698067 | 19.153 |
| 19.998897797145002 | 19.165 |